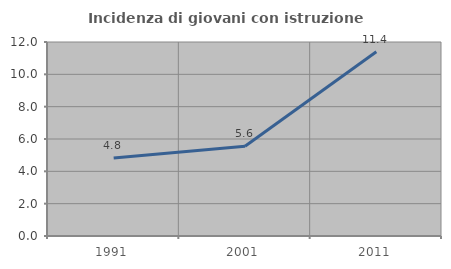
| Category | Incidenza di giovani con istruzione universitaria |
|---|---|
| 1991.0 | 4.819 |
| 2001.0 | 5.556 |
| 2011.0 | 11.392 |